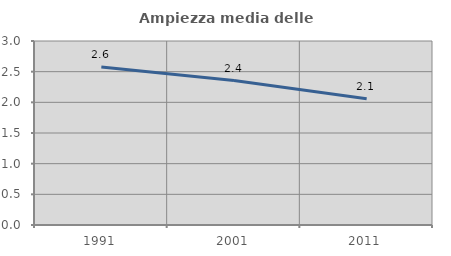
| Category | Ampiezza media delle famiglie |
|---|---|
| 1991.0 | 2.577 |
| 2001.0 | 2.356 |
| 2011.0 | 2.057 |